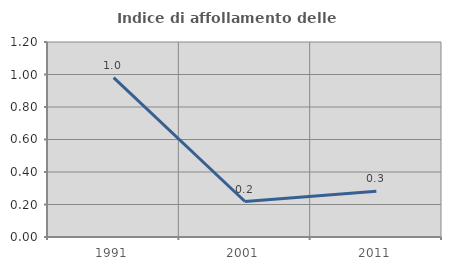
| Category | Indice di affollamento delle abitazioni  |
|---|---|
| 1991.0 | 0.981 |
| 2001.0 | 0.218 |
| 2011.0 | 0.282 |